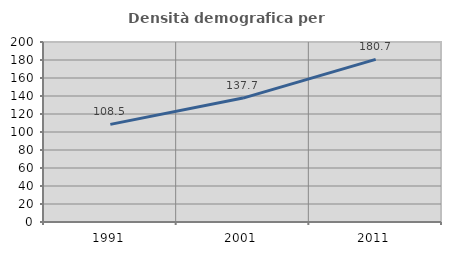
| Category | Densità demografica |
|---|---|
| 1991.0 | 108.464 |
| 2001.0 | 137.672 |
| 2011.0 | 180.663 |